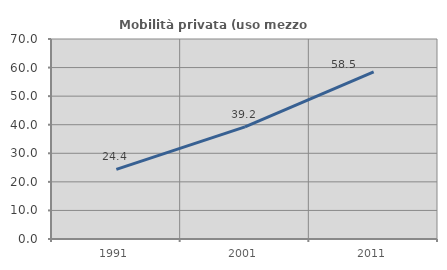
| Category | Mobilità privata (uso mezzo privato) |
|---|---|
| 1991.0 | 24.35 |
| 2001.0 | 39.249 |
| 2011.0 | 58.464 |